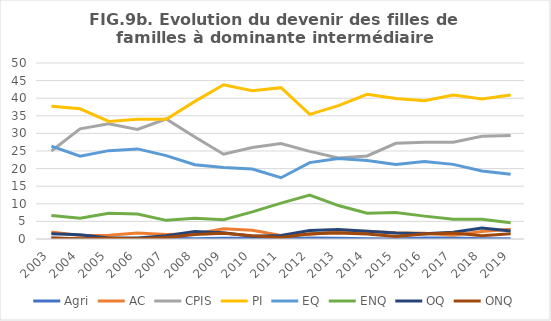
| Category | Agri | AC | CPIS | PI | EQ | ENQ | OQ | ONQ |
|---|---|---|---|---|---|---|---|---|
| 2003.0 | 0.3 | 2 | 25 | 37.7 | 26.4 | 6.7 | 1.5 | 0.3 |
| 2004.0 | 0 | 1 | 31.3 | 37 | 23.5 | 5.9 | 1.2 | 0.1 |
| 2005.0 | 0 | 1.1 | 32.7 | 33.4 | 25.1 | 7.3 | 0.3 | 0.2 |
| 2006.0 | 0.1 | 1.7 | 31.1 | 34 | 25.6 | 7.1 | 0.3 | 0.1 |
| 2007.0 | 0.2 | 1.3 | 34.1 | 34 | 23.7 | 5.3 | 0.9 | 0.4 |
| 2008.0 | 0.1 | 1.4 | 29 | 39.1 | 21.1 | 5.9 | 2.1 | 1.3 |
| 2009.0 | 0.2 | 2.9 | 24.1 | 43.8 | 20.3 | 5.5 | 1.8 | 1.6 |
| 2010.0 | 0.2 | 2.5 | 26 | 42.1 | 19.9 | 7.7 | 0.8 | 0.9 |
| 2011.0 | 0 | 1 | 27.1 | 43 | 17.4 | 10.2 | 1 | 0.4 |
| 2012.0 | 0.3 | 1.3 | 24.9 | 35.4 | 21.7 | 12.5 | 2.4 | 1.5 |
| 2013.0 | 0.2 | 2.1 | 23 | 37.9 | 22.9 | 9.5 | 2.7 | 1.7 |
| 2014.0 | 0.1 | 2.2 | 23.6 | 41.1 | 22.3 | 7.3 | 2.2 | 1.4 |
| 2015.0 | 0 | 1.8 | 27.2 | 39.9 | 21.2 | 7.5 | 1.7 | 0.7 |
| 2016.0 | 0.3 | 1.6 | 27.5 | 39.3 | 22 | 6.5 | 1.47 | 1.4 |
| 2017.0 | 0.3 | 1.1 | 27.5 | 40.9 | 21.2 | 5.6 | 1.9 | 1.7 |
| 2018.0 | 0.1 | 2.1 | 29.2 | 39.8 | 19.3 | 5.6 | 3.1 | 0.9 |
| 2019.0 | 0.1 | 2.8 | 29.4 | 40.9 | 18.4 | 4.6 | 2.3 | 1.5 |